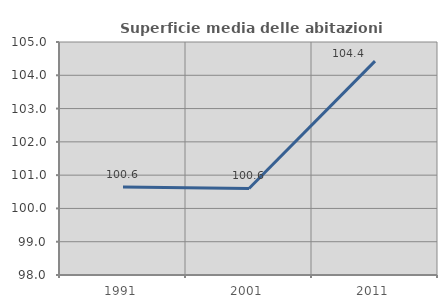
| Category | Superficie media delle abitazioni occupate |
|---|---|
| 1991.0 | 100.646 |
| 2001.0 | 100.6 |
| 2011.0 | 104.425 |